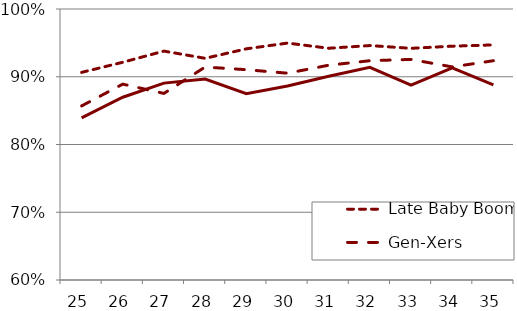
| Category | Late Baby Boomers | Gen-Xers | Millennials |
|---|---|---|---|
| 25.0 | 0.906 | 0.857 | 0.839 |
| 26.0 | 0.921 | 0.889 | 0.87 |
| 27.0 | 0.938 | 0.875 | 0.891 |
| 28.0 | 0.927 | 0.914 | 0.897 |
| 29.0 | 0.941 | 0.91 | 0.875 |
| 30.0 | 0.95 | 0.905 | 0.886 |
| 31.0 | 0.942 | 0.917 | 0.901 |
| 32.0 | 0.946 | 0.924 | 0.914 |
| 33.0 | 0.942 | 0.926 | 0.888 |
| 34.0 | 0.945 | 0.915 | 0.913 |
| 35.0 | 0.947 | 0.924 | 0.888 |